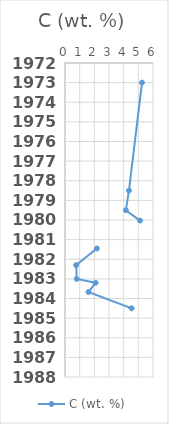
| Category | C (wt. %) |
|---|---|
| 5.25 | 1973 |
| 4.36 | 1978.5 |
| 4.15 | 1979.5 |
| 5.12 | 1980.03 |
| nan | 1980.95 |
| 2.17 | 1981.45 |
| 0.76 | 1982.3 |
| 0.8 | 1983 |
| 2.09 | 1983.2 |
| 1.6 | 1983.67 |
| 4.54 | 1984.5 |